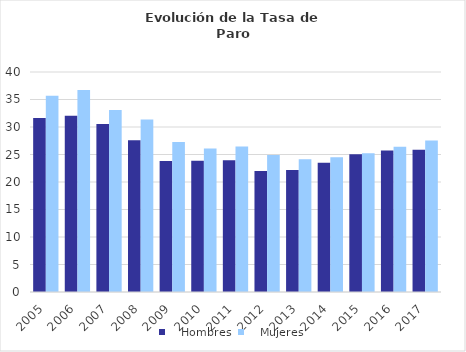
| Category |    Hombres |    Mujeres |
|---|---|---|
| 2005.0 | 31.656 | 35.695 |
| 2006.0 | 32.035 | 36.74 |
| 2007.0 | 30.567 | 33.109 |
| 2008.0 | 27.582 | 31.359 |
| 2009.0 | 23.796 | 27.288 |
| 2010.0 | 23.866 | 26.111 |
| 2011.0 | 23.958 | 26.456 |
| 2012.0 | 22.019 | 24.914 |
| 2013.0 | 22.204 | 24.14 |
| 2014.0 | 23.518 | 24.521 |
| 2015.0 | 25.055 | 25.235 |
| 2016.0 | 25.739 | 26.403 |
| 2017.0 | 25.876 | 27.533 |